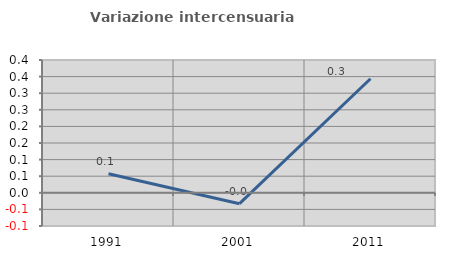
| Category | Variazione intercensuaria annua |
|---|---|
| 1991.0 | 0.057 |
| 2001.0 | -0.033 |
| 2011.0 | 0.344 |